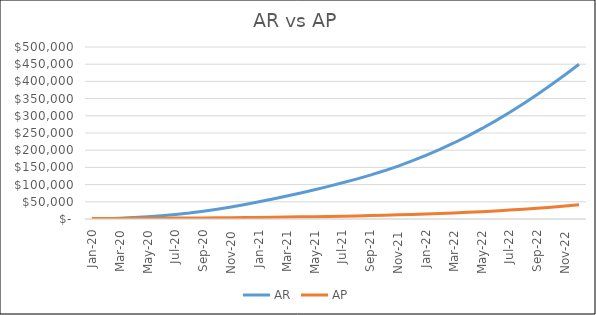
| Category | AR | AP |
|---|---|---|
| 2020-01-01 | 0 | 1479.452 |
| 2020-02-29 | 813.699 | 1627.397 |
| 2020-03-31 | 2214.405 | 1790.137 |
| 2020-04-30 | 4265.978 | 1969.151 |
| 2020-05-31 | 6614.652 | 2166.066 |
| 2020-06-30 | 9620.502 | 2382.672 |
| 2020-07-31 | 13331.076 | 2620.94 |
| 2020-08-31 | 17377.88 | 2883.034 |
| 2020-09-30 | 22514.562 | 3171.337 |
| 2020-10-31 | 28541.339 | 3488.471 |
| 2020-11-30 | 35067.652 | 3837.318 |
| 2020-12-31 | 42219.033 | 4221.049 |
| 2021-01-31 | 49925.988 | 4643.154 |
| 2021-02-28 | 58139.892 | 5107.47 |
| 2021-03-31 | 66630.363 | 5618.217 |
| 2021-04-30 | 75727.314 | 6180.038 |
| 2021-05-31 | 85126.054 | 6798.042 |
| 2021-06-30 | 94931.984 | 7477.846 |
| 2021-07-31 | 105372.941 | 8225.631 |
| 2021-08-31 | 115997.896 | 9048.194 |
| 2021-09-30 | 127541.319 | 9953.014 |
| 2021-10-31 | 140112.358 | 10948.315 |
| 2021-11-30 | 153801.505 | 12043.146 |
| 2021-12-31 | 168682.324 | 13247.461 |
| 2022-01-31 | 184813.054 | 14572.207 |
| 2022-02-28 | 202238.08 | 16029.428 |
| 2022-03-31 | 220989.291 | 17632.371 |
| 2022-04-30 | 241087.333 | 19395.608 |
| 2022-05-31 | 262542.762 | 21335.169 |
| 2022-06-30 | 285357.105 | 23468.685 |
| 2022-07-31 | 309523.837 | 25815.554 |
| 2022-08-31 | 335029.276 | 28397.109 |
| 2022-09-30 | 361853.412 | 31236.82 |
| 2022-10-31 | 389970.659 | 34360.502 |
| 2022-11-30 | 419350.554 | 37796.553 |
| 2022-12-31 | 449958.39 | 41576.208 |